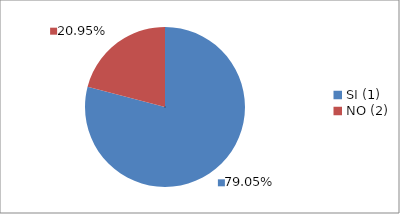
| Category | Series 0 |
|---|---|
| SI (1) | 0.79 |
| NO (2) | 0.21 |